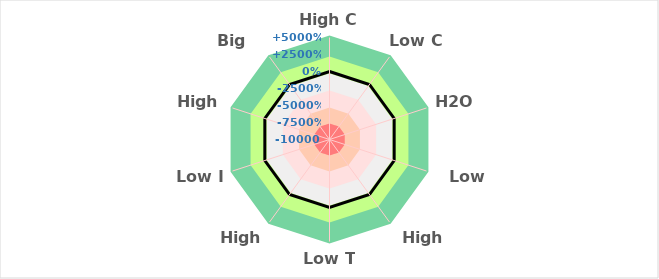
| Category | High C | Series 0 |
|---|---|---|
| High C | 37.5 | 0 |
| Low C | 37.5 | 0 |
| H2O | 37.5 | 0 |
| Low O2 | 37.5 | 0 |
| High O2 | 37.5 | 0 |
| Low T | 37.5 | 0 |
| High T | 37.5 | 0 |
| Low I | 37.5 | 0 |
| High I | 37.5 | 0 |
| Big Scale | 37.5 | 0 |